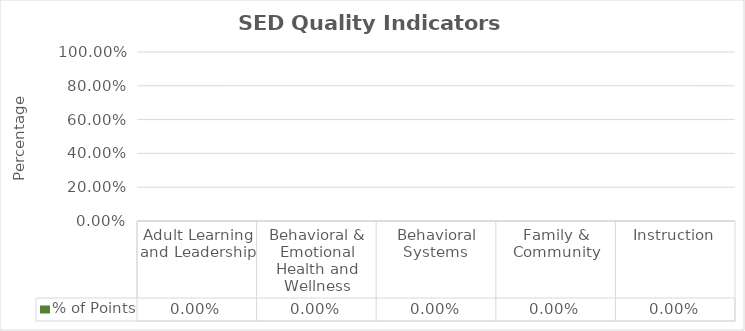
| Category | % of Points |
|---|---|
| Adult Learning and Leadership | 0 |
| Behavioral & Emotional Health and Wellness | 0 |
| Behavioral Systems  | 0 |
| Family & Community | 0 |
| Instruction | 0 |